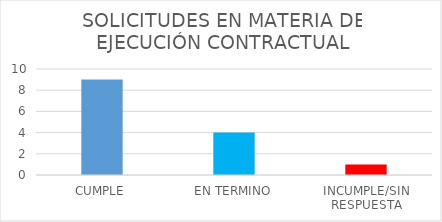
| Category | TOTAL |
|---|---|
| CUMPLE | 9 |
| EN TERMINO | 4 |
| INCUMPLE/SIN RESPUESTA | 1 |